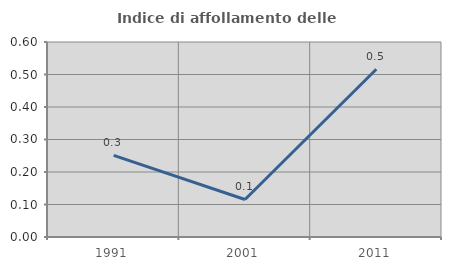
| Category | Indice di affollamento delle abitazioni  |
|---|---|
| 1991.0 | 0.251 |
| 2001.0 | 0.115 |
| 2011.0 | 0.516 |